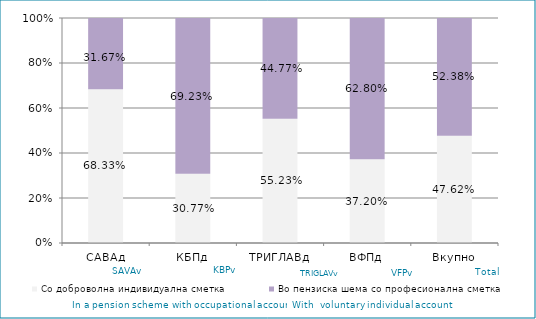
| Category | Со доброволна индивидуална сметка  | Во пензиска шема со професионална сметка |
|---|---|---|
| САВАд | 0.683 | 0.317 |
| КБПд | 0.308 | 0.692 |
| ТРИГЛАВд | 0.552 | 0.448 |
| ВФПд | 0.372 | 0.628 |
| Вкупно | 0.476 | 0.524 |